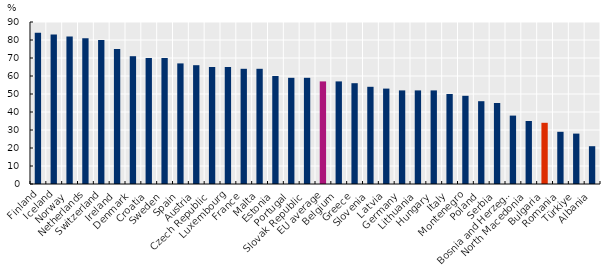
| Category | Series 0 |
|---|---|
| Finland | 84 |
| Iceland | 83 |
| Norway | 82 |
| Netherlands | 81 |
| Switzerland | 80 |
| Ireland | 75 |
| Denmark | 71 |
| Croatia | 70 |
| Sweden | 70 |
| Spain | 67 |
| Austria | 66 |
| Czech Republic | 65 |
| Luxembourg | 65 |
| France | 64 |
| Malta | 64 |
| Estonia | 60 |
| Portugal | 59 |
| Slovak Republic | 59 |
| EU average | 57 |
| Belgium | 57 |
| Greece | 56 |
| Slovenia | 54 |
| Latvia | 53 |
| Germany | 52 |
| Lithuania | 52 |
| Hungary | 52 |
| Italy | 50 |
| Montenegro | 49 |
| Poland | 46 |
| Serbia | 45 |
| Bosnia and Herzegovina | 38 |
| North Macedonia | 35 |
| Bulgaria | 34 |
| Romania | 29 |
| Türkiye | 28 |
| Albania | 21 |